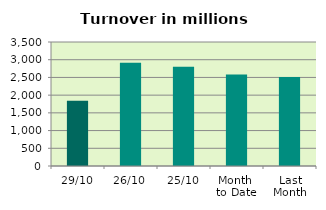
| Category | Series 0 |
|---|---|
| 29/10 | 1839.729 |
| 26/10 | 2916.778 |
| 25/10 | 2798.178 |
| Month 
to Date | 2579.308 |
| Last
Month | 2513.15 |